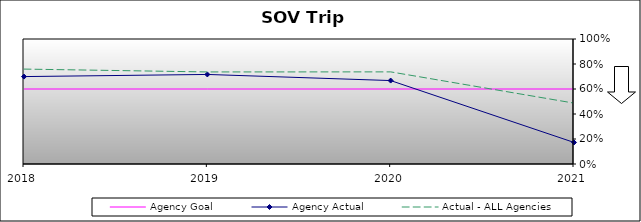
| Category | Agency Goal | Agency Actual | Actual - ALL Agencies |
|---|---|---|---|
| 2018.0 | 0.6 | 0.699 | 0.759 |
| 2019.0 | 0.6 | 0.716 | 0.736 |
| 2020.0 | 0.6 | 0.667 | 0.737 |
| 2021.0 | 0.6 | 0.172 | 0.487 |